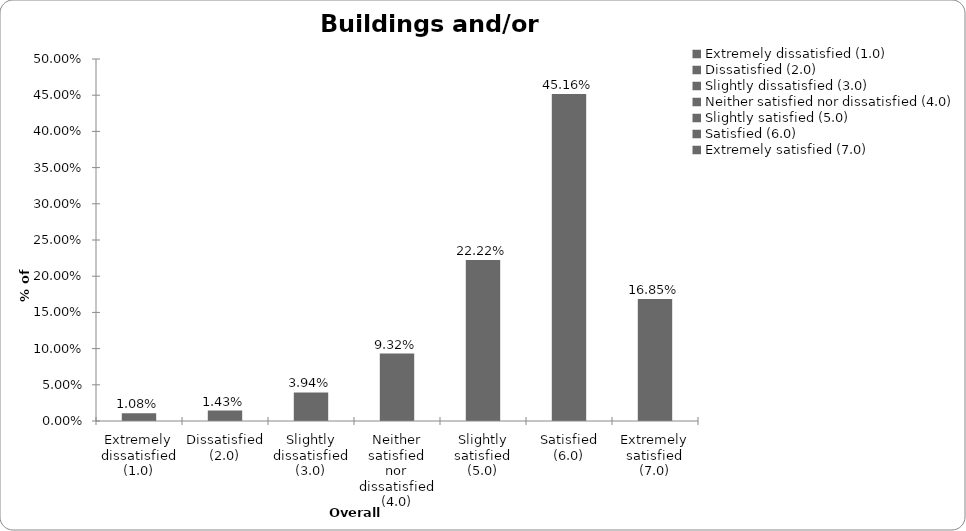
| Category | Series 0 |
|---|---|
| Extremely dissatisfied (1.0) | 0.011 |
| Dissatisfied (2.0) | 0.014 |
| Slightly dissatisfied (3.0) | 0.039 |
| Neither satisfied nor dissatisfied (4.0) | 0.093 |
| Slightly satisfied (5.0) | 0.222 |
| Satisfied (6.0) | 0.452 |
| Extremely satisfied (7.0) | 0.168 |